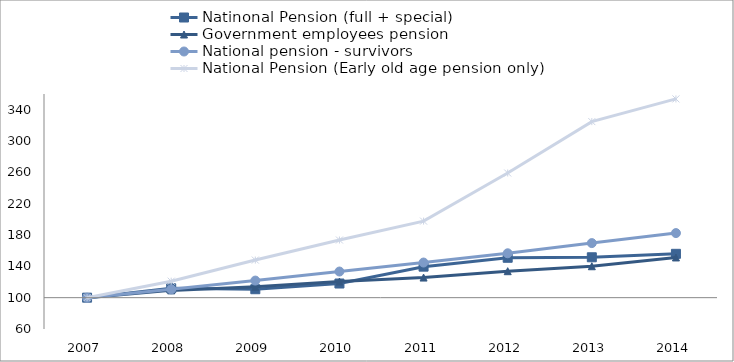
| Category | Natinonal Pension (full + special) | Government employees pension | National pension - survivors | National Pension (Early old age pension only) |
|---|---|---|---|---|
| 2007.0 | 100 | 100 | 100 | 100 |
| 2008.0 | 111.954 | 109.303 | 110.623 | 121.032 |
| 2009.0 | 110.775 | 113.856 | 121.809 | 147.997 |
| 2010.0 | 118.064 | 120.523 | 133.369 | 173.581 |
| 2011.0 | 139.59 | 125.669 | 144.85 | 197.742 |
| 2012.0 | 150.933 | 133.787 | 156.666 | 259.134 |
| 2013.0 | 151.576 | 140.121 | 169.665 | 324.766 |
| 2014.0 | 155.973 | 151.329 | 182.441 | 353.717 |